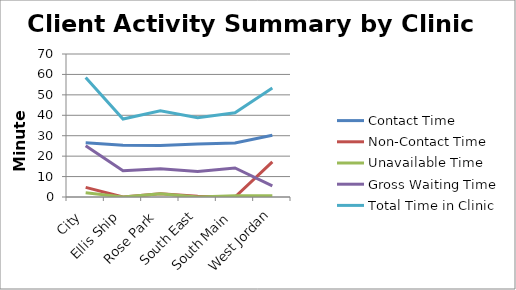
| Category | Contact Time | Non-Contact Time | Unavailable Time | Gross Waiting Time | Total Time in Clinic |
|---|---|---|---|---|---|
| City | 26.61 | 4.71 | 2.13 | 25.1 | 58.55 |
| Ellis Ship | 25.28 | 0 | 0 | 12.91 | 38.19 |
| Rose Park | 25.25 | 1.6 | 1.58 | 13.81 | 42.23 |
| South East | 25.99 | 0.34 | 0 | 12.47 | 38.8 |
| South Main | 26.41 | 0 | 0.58 | 14.22 | 41.2 |
| West Jordan | 30.19 | 17.17 | 0.56 | 5.47 | 53.39 |